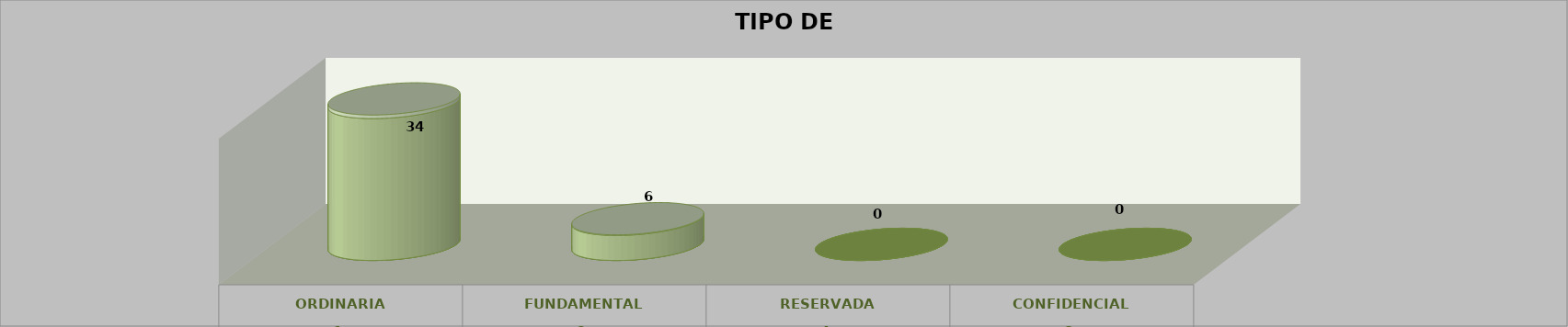
| Category | Series 0 | Series 2 | Series 1 | Series 3 | Series 4 |
|---|---|---|---|---|---|
| 0 |  |  |  | 34 | 0.85 |
| 1 |  |  |  | 6 | 0.15 |
| 2 |  |  |  | 0 | 0 |
| 3 |  |  |  | 0 | 0 |